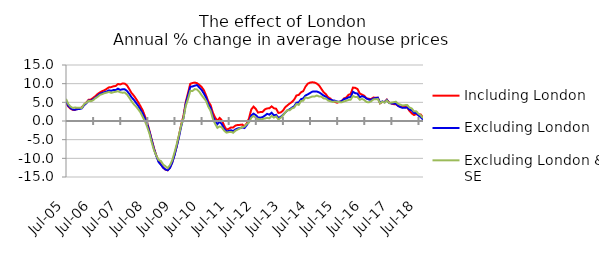
| Category | Including London | Excluding London | Excluding London & SE |
|---|---|---|---|
| 2005-07-01 | 4.929 | 5.234 | 5.912 |
| 2005-08-01 | 3.904 | 4.11 | 4.579 |
| 2005-09-01 | 3.307 | 3.467 | 3.845 |
| 2005-10-01 | 2.983 | 3.057 | 3.504 |
| 2005-11-01 | 2.97 | 3.027 | 3.61 |
| 2005-12-01 | 3.282 | 3.163 | 3.554 |
| 2006-01-01 | 3.392 | 3.23 | 3.526 |
| 2006-02-01 | 3.661 | 3.384 | 3.507 |
| 2006-03-01 | 4.324 | 4.241 | 4.508 |
| 2006-04-01 | 4.937 | 4.745 | 4.889 |
| 2006-05-01 | 5.692 | 5.5 | 5.409 |
| 2006-06-01 | 5.74 | 5.391 | 5.297 |
| 2006-07-01 | 6.189 | 5.833 | 5.562 |
| 2006-08-01 | 6.652 | 6.246 | 6.111 |
| 2006-09-01 | 7.224 | 6.766 | 6.471 |
| 2006-10-01 | 7.66 | 7.279 | 6.993 |
| 2006-11-01 | 7.994 | 7.519 | 7.201 |
| 2006-12-01 | 8.229 | 7.714 | 7.454 |
| 2007-01-01 | 8.608 | 7.898 | 7.611 |
| 2007-02-01 | 9.011 | 8.213 | 7.807 |
| 2007-03-01 | 9.08 | 8.094 | 7.535 |
| 2007-04-01 | 9.295 | 8.304 | 7.716 |
| 2007-05-01 | 9.388 | 8.306 | 7.832 |
| 2007-06-01 | 9.907 | 8.66 | 7.966 |
| 2007-07-01 | 9.788 | 8.343 | 7.697 |
| 2007-08-01 | 10.057 | 8.482 | 7.582 |
| 2007-09-01 | 10.004 | 8.485 | 7.621 |
| 2007-10-01 | 9.547 | 8.05 | 7.097 |
| 2007-11-01 | 8.556 | 7.262 | 6.242 |
| 2007-12-01 | 7.513 | 6.355 | 5.285 |
| 2008-01-01 | 6.804 | 5.702 | 4.489 |
| 2008-02-01 | 5.949 | 4.882 | 3.861 |
| 2008-03-01 | 4.981 | 4.03 | 3.108 |
| 2008-04-01 | 3.926 | 3.04 | 2.268 |
| 2008-05-01 | 2.778 | 1.996 | 1.026 |
| 2008-06-01 | 1.183 | 0.603 | -0.123 |
| 2008-07-01 | -0.603 | -0.964 | -1.66 |
| 2008-08-01 | -2.766 | -3.011 | -3.518 |
| 2008-09-01 | -5.136 | -5.317 | -5.868 |
| 2008-10-01 | -7.399 | -7.61 | -7.927 |
| 2008-11-01 | -9.296 | -9.441 | -9.326 |
| 2008-12-01 | -10.78 | -11.022 | -10.45 |
| 2009-01-01 | -11.611 | -11.692 | -10.714 |
| 2009-02-01 | -12.508 | -12.526 | -11.659 |
| 2009-03-01 | -13.003 | -12.983 | -12.112 |
| 2009-04-01 | -13.206 | -13.181 | -12.62 |
| 2009-05-01 | -12.458 | -12.581 | -11.826 |
| 2009-06-01 | -11.081 | -11.188 | -10.551 |
| 2009-07-01 | -9.049 | -9.241 | -8.491 |
| 2009-08-01 | -6.731 | -6.878 | -6.239 |
| 2009-09-01 | -3.878 | -4.304 | -3.732 |
| 2009-10-01 | -0.95 | -1.35 | -1.078 |
| 2009-11-01 | 1.436 | 0.841 | 0.812 |
| 2009-12-01 | 5.087 | 4.677 | 4.051 |
| 2010-01-01 | 7.476 | 6.847 | 5.855 |
| 2010-02-01 | 9.957 | 9.158 | 8.026 |
| 2010-03-01 | 10.187 | 9.249 | 8.046 |
| 2010-04-01 | 10.293 | 9.464 | 8.539 |
| 2010-05-01 | 10.134 | 9.636 | 8.443 |
| 2010-06-01 | 9.686 | 8.974 | 7.819 |
| 2010-07-01 | 9.13 | 8.344 | 6.927 |
| 2010-08-01 | 8.277 | 7.375 | 6.148 |
| 2010-09-01 | 6.825 | 6.297 | 5.38 |
| 2010-10-01 | 5.198 | 4.562 | 3.81 |
| 2010-11-01 | 4.242 | 3.499 | 2.719 |
| 2010-12-01 | 2.222 | 1.247 | 0.588 |
| 2011-01-01 | 0.939 | 0.042 | -0.777 |
| 2011-02-01 | 0.059 | -0.86 | -1.827 |
| 2011-03-01 | 0.819 | -0.208 | -1.448 |
| 2011-04-01 | 0.169 | -0.876 | -1.735 |
| 2011-05-01 | -1.249 | -2.089 | -2.594 |
| 2011-06-01 | -2.327 | -2.799 | -3.113 |
| 2011-07-01 | -2.111 | -2.68 | -2.984 |
| 2011-08-01 | -1.734 | -2.479 | -2.912 |
| 2011-09-01 | -1.719 | -2.708 | -3.153 |
| 2011-10-01 | -1.214 | -2.257 | -2.603 |
| 2011-11-01 | -1.069 | -1.996 | -2.263 |
| 2011-12-01 | -1.035 | -1.886 | -1.981 |
| 2012-01-01 | -0.955 | -1.72 | -1.646 |
| 2012-02-01 | -1.387 | -1.875 | -1.499 |
| 2012-03-01 | -0.651 | -1.096 | -0.794 |
| 2012-04-01 | 0.731 | -0.125 | -0.376 |
| 2012-05-01 | 3.09 | 1.481 | 0.883 |
| 2012-06-01 | 3.853 | 1.977 | 1.347 |
| 2012-07-01 | 3.236 | 1.571 | 0.934 |
| 2012-08-01 | 2.256 | 0.937 | 0.481 |
| 2012-09-01 | 2.394 | 0.888 | 0.351 |
| 2012-10-01 | 2.437 | 1.034 | 0.539 |
| 2012-11-01 | 3.088 | 1.426 | 0.672 |
| 2012-12-01 | 3.374 | 1.912 | 0.837 |
| 2013-01-01 | 3.401 | 1.699 | 0.715 |
| 2013-02-01 | 3.923 | 2.206 | 1.359 |
| 2013-03-01 | 3.418 | 1.52 | 0.906 |
| 2013-04-01 | 3.278 | 1.644 | 1.225 |
| 2013-05-01 | 2.166 | 0.851 | 0.404 |
| 2013-06-01 | 2.285 | 1.099 | 0.851 |
| 2013-07-01 | 2.753 | 1.602 | 1.473 |
| 2013-08-01 | 3.667 | 2.247 | 2.226 |
| 2013-09-01 | 4.2 | 2.86 | 2.912 |
| 2013-10-01 | 4.672 | 3.129 | 2.875 |
| 2013-11-01 | 5.097 | 3.584 | 3.376 |
| 2013-12-01 | 5.734 | 3.954 | 3.609 |
| 2014-01-01 | 6.843 | 4.907 | 4.542 |
| 2014-02-01 | 6.983 | 4.965 | 4.317 |
| 2014-03-01 | 7.681 | 5.847 | 5.343 |
| 2014-04-01 | 8.001 | 6.044 | 5.45 |
| 2014-05-01 | 9.211 | 6.845 | 6.326 |
| 2014-06-01 | 9.998 | 7.125 | 6.115 |
| 2014-07-01 | 10.284 | 7.494 | 6.334 |
| 2014-08-01 | 10.371 | 7.86 | 6.56 |
| 2014-09-01 | 10.314 | 7.927 | 6.564 |
| 2014-10-01 | 10.032 | 7.894 | 6.813 |
| 2014-11-01 | 9.522 | 7.679 | 6.573 |
| 2014-12-01 | 8.631 | 7.277 | 6.549 |
| 2015-01-01 | 7.731 | 6.813 | 6.058 |
| 2015-02-01 | 7.186 | 6.505 | 6.026 |
| 2015-03-01 | 6.343 | 5.977 | 5.483 |
| 2015-04-01 | 6.022 | 5.732 | 5.304 |
| 2015-05-01 | 5.4 | 5.522 | 5.107 |
| 2015-06-01 | 5.119 | 5.447 | 5.233 |
| 2015-07-01 | 4.895 | 5.208 | 5.134 |
| 2015-08-01 | 5.145 | 5.128 | 5.054 |
| 2015-09-01 | 5.313 | 5.319 | 4.994 |
| 2015-10-01 | 6.033 | 5.873 | 5.273 |
| 2015-11-01 | 6.276 | 5.999 | 5.404 |
| 2015-12-01 | 6.992 | 6.339 | 5.631 |
| 2016-01-01 | 7.254 | 6.427 | 5.715 |
| 2016-02-01 | 8.952 | 7.83 | 6.69 |
| 2016-03-01 | 8.888 | 7.448 | 6.427 |
| 2016-04-01 | 8.591 | 7.359 | 6.427 |
| 2016-05-01 | 7.371 | 6.358 | 5.693 |
| 2016-06-01 | 7.084 | 6.666 | 5.925 |
| 2016-07-01 | 6.779 | 6.463 | 5.632 |
| 2016-08-01 | 6.064 | 6.038 | 5.085 |
| 2016-09-01 | 5.961 | 5.746 | 5.002 |
| 2016-10-01 | 5.857 | 5.668 | 5.238 |
| 2016-11-01 | 6.276 | 6.026 | 5.773 |
| 2016-12-01 | 6.235 | 6.125 | 5.849 |
| 2017-01-01 | 6.237 | 6.242 | 5.868 |
| 2017-02-01 | 4.745 | 4.861 | 4.74 |
| 2017-03-01 | 5.119 | 5.248 | 5.178 |
| 2017-04-01 | 5.078 | 5.012 | 4.917 |
| 2017-05-01 | 5.731 | 5.65 | 5.503 |
| 2017-06-01 | 4.941 | 4.809 | 4.827 |
| 2017-07-01 | 4.708 | 4.714 | 4.929 |
| 2017-08-01 | 4.514 | 4.67 | 5.037 |
| 2017-09-01 | 4.497 | 4.641 | 5.163 |
| 2017-10-01 | 4.035 | 4.052 | 4.594 |
| 2017-11-01 | 3.845 | 3.728 | 4.378 |
| 2017-12-01 | 3.818 | 3.515 | 4.15 |
| 2018-01-01 | 3.795 | 3.548 | 4.244 |
| 2018-02-01 | 3.599 | 3.62 | 4.299 |
| 2018-03-01 | 2.729 | 3.039 | 3.619 |
| 2018-04-01 | 2.057 | 2.879 | 3.367 |
| 2018-05-01 | 1.615 | 2.142 | 2.602 |
| 2018-06-01 | 1.836 | 2.13 | 2.579 |
| 2018-07-01 | 1.823 | 1.463 | 1.966 |
| 2018-08-01 | 1.721 | 1.056 | 1.524 |
| 2018-09-01 | 0.938 | 0.393 | 0.763 |